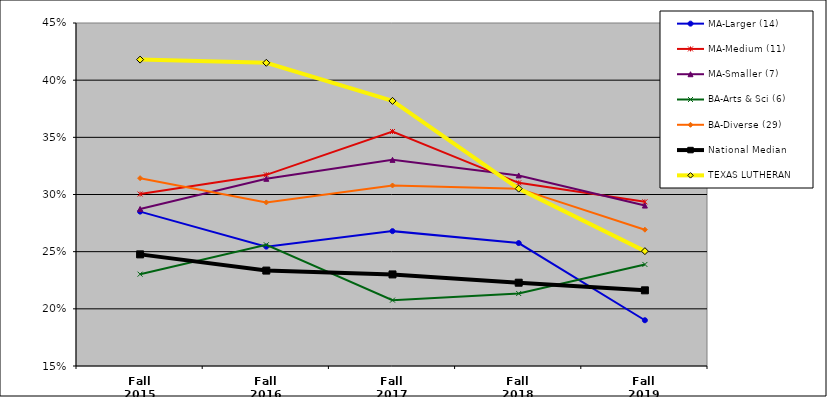
| Category | MA-Larger (14) | MA-Medium (11) | MA-Smaller (7) | BA-Arts & Sci (6) | BA-Diverse (29) | National Median | TEXAS LUTHERAN |
|---|---|---|---|---|---|---|---|
| Fall 2015 | 0.285 | 0.3 | 0.287 | 0.23 | 0.314 | 0.248 | 0.418 |
| Fall 2016 | 0.254 | 0.317 | 0.314 | 0.256 | 0.293 | 0.233 | 0.415 |
| Fall 2017 | 0.268 | 0.355 | 0.33 | 0.208 | 0.308 | 0.23 | 0.382 |
| Fall 2018 | 0.258 | 0.31 | 0.317 | 0.213 | 0.305 | 0.223 | 0.305 |
| Fall 2019 | 0.19 | 0.294 | 0.29 | 0.239 | 0.269 | 0.216 | 0.25 |